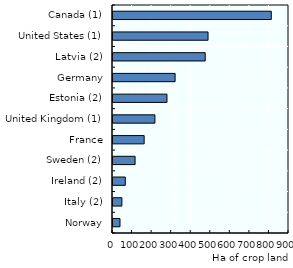
| Category | 2010 |
|---|---|
| Norway | 35.724 |
| Italy (2) | 45.4 |
| Ireland (2) | 62.8 |
| Sweden (2) | 112.92 |
| France | 159.35 |
| United Kingdom (1) | 214.3 |
| Estonia (2) | 275.9 |
| Germany | 317.6 |
| Latvia (2) | 471.5 |
| United States (1) | 486 |
| Canada (1) | 809.371 |